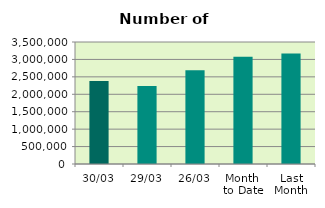
| Category | Series 0 |
|---|---|
| 30/03 | 2382264 |
| 29/03 | 2236984 |
| 26/03 | 2689892 |
| Month 
to Date | 3078502.545 |
| Last
Month | 3172414.4 |